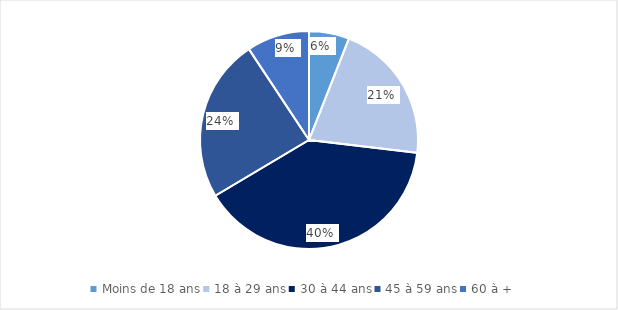
| Category | Series 0 |
|---|---|
| Moins de 18 ans | 0.06 |
| 18 à 29 ans | 0.209 |
| 30 à 44 ans | 0.396 |
| 45 à 59 ans | 0.242 |
| 60 à + | 0.093 |